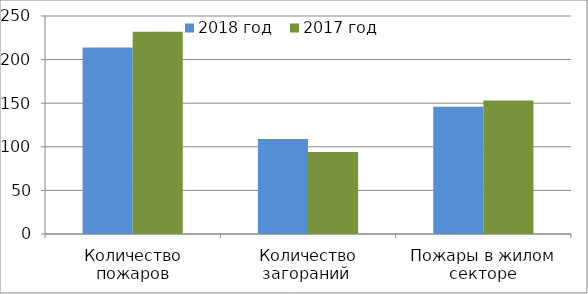
| Category | 2018 год | 2017 год |
|---|---|---|
| Количество пожаров | 214 | 232 |
| Количество загораний  | 109 | 94 |
| Пожары в жилом секторе | 146 | 153 |